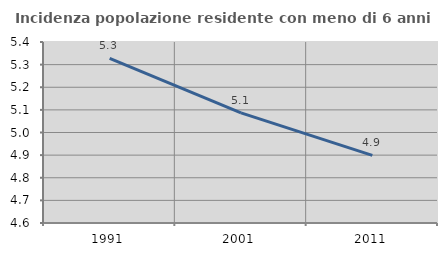
| Category | Incidenza popolazione residente con meno di 6 anni |
|---|---|
| 1991.0 | 5.327 |
| 2001.0 | 5.087 |
| 2011.0 | 4.899 |